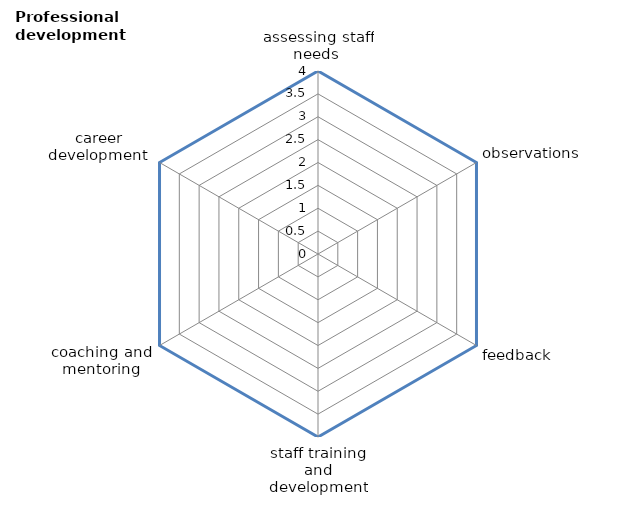
| Category | Series 0 | Series 1 |
|---|---|---|
| assessing staff needs  | 4 | 0 |
| observations | 4 | 0 |
| feedback | 4 | 0 |
| staff training and development | 4 | 0 |
| coaching and mentoring | 4 | 0 |
| career development  | 4 | 0 |